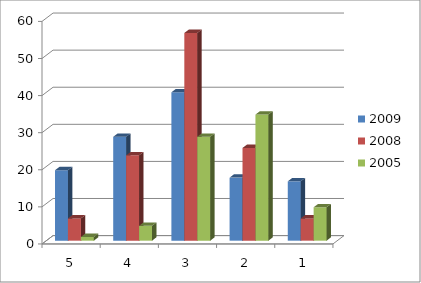
| Category | 2009 | 2008 | 2005 |
|---|---|---|---|
| 5.0 | 19 | 6 | 1 |
| 4.0 | 28 | 23 | 4 |
| 3.0 | 40 | 56 | 28 |
| 2.0 | 17 | 25 | 34 |
| 1.0 | 16 | 6 | 9 |